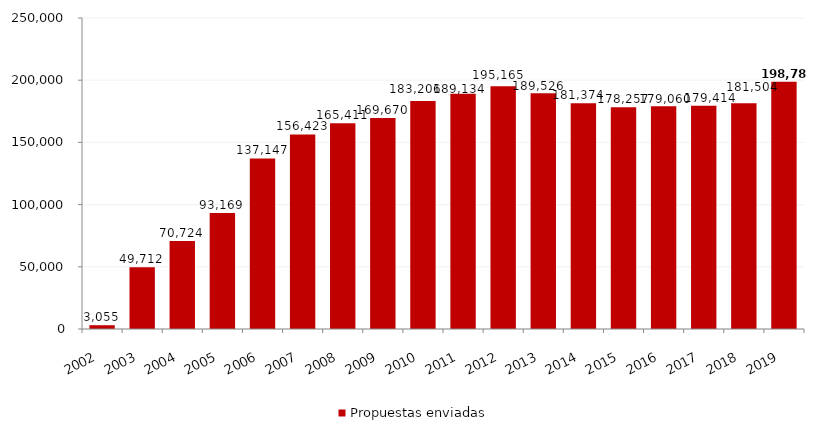
| Category | Propuestas enviadas |
|---|---|
| 2002.0 | 3055 |
| 2003.0 | 49712 |
| 2004.0 | 70724 |
| 2005.0 | 93169 |
| 2006.0 | 137147 |
| 2007.0 | 156423 |
| 2008.0 | 165411 |
| 2009.0 | 169670 |
| 2010.0 | 183206 |
| 2011.0 | 189134 |
| 2012.0 | 195165 |
| 2013.0 | 189526 |
| 2014.0 | 181374 |
| 2015.0 | 178257 |
| 2016.0 | 179060 |
| 2017.0 | 179414 |
| 2018.0 | 181504 |
| 2019.0 | 198782 |